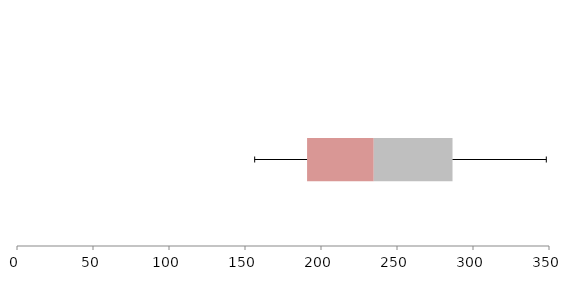
| Category | Series 1 | Series 2 | Series 3 |
|---|---|---|---|
| 0 | 190.839 | 43.859 | 51.83 |